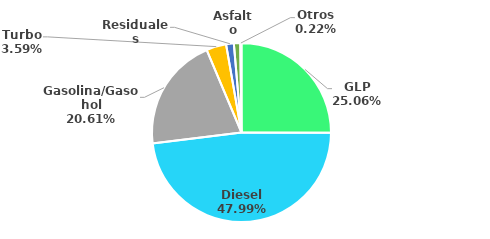
| Category | MBPD |
|---|---|
| GLP | 60.005 |
| Diesel | 114.909 |
| Gasolina/Gasohol | 49.338 |
| Turbo | 8.594 |
| Residuales | 3.335 |
| Asfalto | 2.757 |
| Otros | 0.518 |